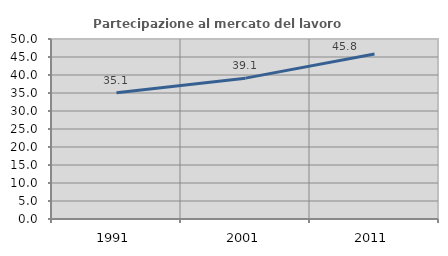
| Category | Partecipazione al mercato del lavoro  femminile |
|---|---|
| 1991.0 | 35.097 |
| 2001.0 | 39.127 |
| 2011.0 | 45.839 |